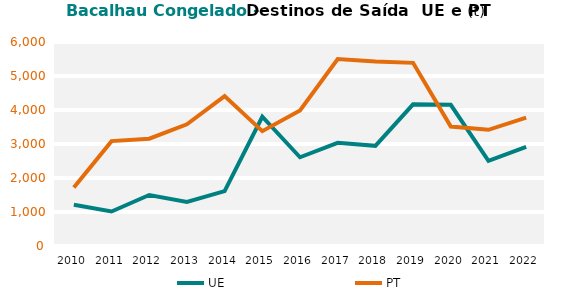
| Category | UE | PT |
|---|---|---|
| 2010.0 | 1213.489 | 1718.562 |
| 2011.0 | 1015.842 | 3084.794 |
| 2012.0 | 1500.268 | 3156.577 |
| 2013.0 | 1298.399 | 3580.513 |
| 2014.0 | 1615.164 | 4410.866 |
| 2015.0 | 3801.903 | 3377.67 |
| 2016.0 | 2610.365 | 3988.343 |
| 2017.0 | 3034.903 | 5497.407 |
| 2018.0 | 2946.275 | 5423.46 |
| 2019.0 | 4165.164 | 5386.66 |
| 2020.0 | 4152.046 | 3511.459 |
| 2021.0 | 2506.77 | 3416.613 |
| 2022.0 | 2914.276 | 3773.541 |